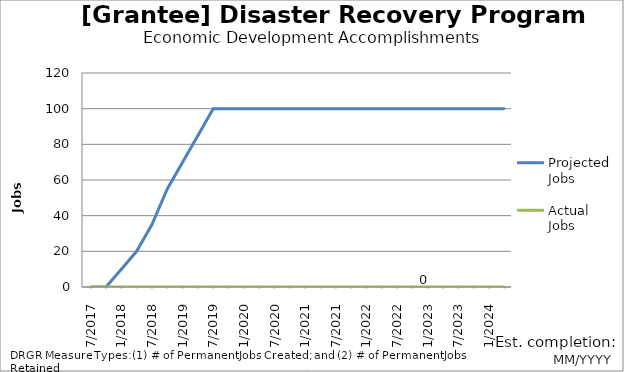
| Category | Projected Jobs | Actual Jobs |
|---|---|---|
| 7/2017 | 0 | 0 |
| 10/2017 | 0 | 0 |
| 1/2018 | 10 | 0 |
| 4/2018 | 20 | 0 |
| 7/2018 | 35 | 0 |
| 10/2018 | 55 | 0 |
| 1/2019 | 70 | 0 |
| 4/2019 | 85 | 0 |
| 7/2019 | 100 | 0 |
| 10/2019 | 100 | 0 |
| 1/2020 | 100 | 0 |
| 4/2020 | 100 | 0 |
| 7/2020 | 100 | 0 |
| 10/2020 | 100 | 0 |
| 1/2021 | 100 | 0 |
| 4/2021 | 100 | 0 |
| 7/2021 | 100 | 0 |
| 10/2021 | 100 | 0 |
| 1/2022 | 100 | 0 |
| 4/2022 | 100 | 0 |
| 7/2022 | 100 | 0 |
| 10/2022 | 100 | 0 |
| 1/2023 | 100 | 0 |
| 4/2023 | 100 | 0 |
| 7/2023 | 100 | 0 |
| 10/2023 | 100 | 0 |
| 1/2024 | 100 | 0 |
| 4/2024 | 100 | 0 |